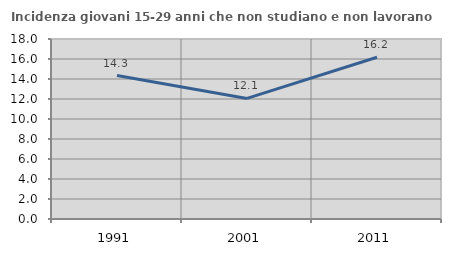
| Category | Incidenza giovani 15-29 anni che non studiano e non lavorano  |
|---|---|
| 1991.0 | 14.346 |
| 2001.0 | 12.058 |
| 2011.0 | 16.178 |